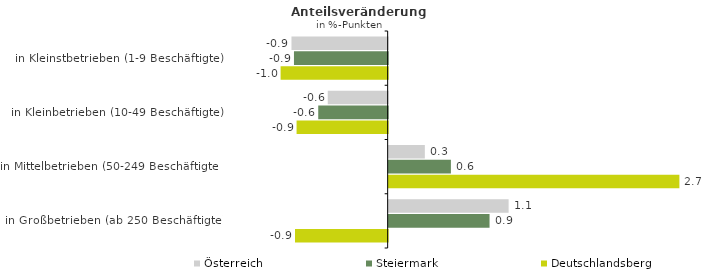
| Category | Österreich | Steiermark | Deutschlandsberg |
|---|---|---|---|
| in Kleinstbetrieben (1-9 Beschäftigte) | -0.898 | -0.875 | -1 |
| in Kleinbetrieben (10-49 Beschäftigte) | -0.559 | -0.648 | -0.85 |
| in Mittelbetrieben (50-249 Beschäftigte) | 0.338 | 0.581 | 2.714 |
| in Großbetrieben (ab 250 Beschäftigte) | 1.12 | 0.942 | -0.865 |